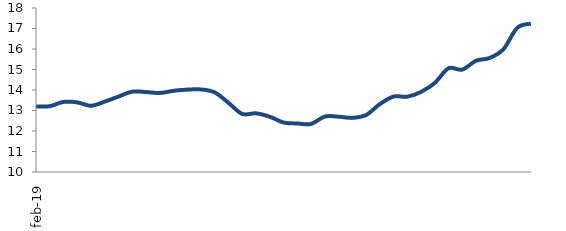
| Category | Series 0 |
|---|---|
| 2019-02-01 | 13.198 |
| 2019-03-01 | 13.21 |
| 2019-04-01 | 13.419 |
| 2019-05-01 | 13.397 |
| 2019-06-01 | 13.231 |
| 2019-07-01 | 13.433 |
| 2019-08-01 | 13.679 |
| 2019-09-01 | 13.92 |
| 2019-10-01 | 13.901 |
| 2019-11-01 | 13.855 |
| 2019-12-01 | 13.96 |
| 2020-01-01 | 14.019 |
| 2020-02-01 | 14.026 |
| 2020-03-01 | 13.882 |
| 2020-04-01 | 13.374 |
| 2020-05-01 | 12.833 |
| 2020-06-01 | 12.862 |
| 2020-07-01 | 12.698 |
| 2020-08-01 | 12.414 |
| 2020-09-01 | 12.367 |
| 2020-10-01 | 12.342 |
| 2020-11-01 | 12.705 |
| 2020-12-01 | 12.699 |
| 2021-01-01 | 12.641 |
| 2021-02-01 | 12.779 |
| 2021-03-01 | 13.308 |
| 2021-04-01 | 13.679 |
| 2021-05-01 | 13.675 |
| 2021-06-01 | 13.905 |
| 2021-07-01 | 14.345 |
| 2021-08-01 | 15.059 |
| 2021-09-01 | 14.995 |
| 2021-10-01 | 15.427 |
| 2021-11-01 | 15.564 |
| 2021-12-01 | 15.993 |
| 2022-01-01 | 17.032 |
| 2022-02-01 | 17.239 |